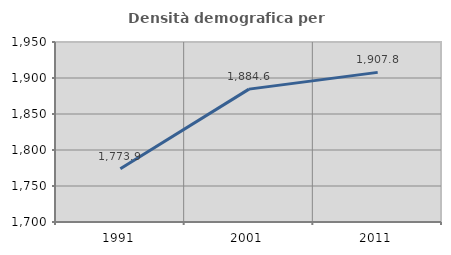
| Category | Densità demografica |
|---|---|
| 1991.0 | 1773.87 |
| 2001.0 | 1884.563 |
| 2011.0 | 1907.818 |